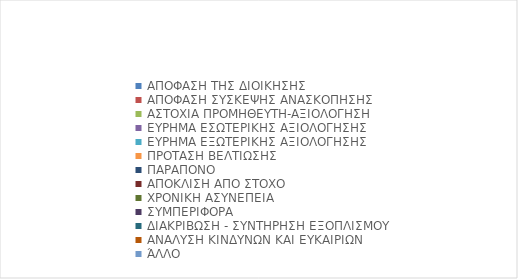
| Category | ΠΛΗΘΟΣ |
|---|---|
| ΕΚΚΡΕΜΗΣ | 0 |
| ΟΛΟΚΛΗΡΩΜΕΝΗ | 0 |